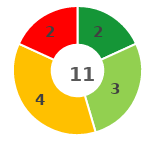
| Category | Series 0 |
|---|---|
| 0 | 2 |
| 1 | 3 |
| 2 | 4 |
| 3 | 2 |
| 4 | 0 |